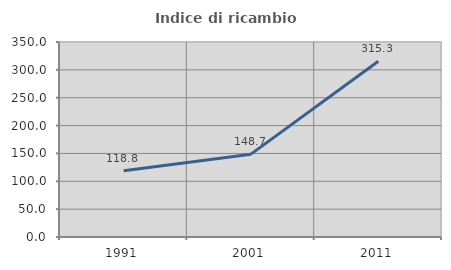
| Category | Indice di ricambio occupazionale  |
|---|---|
| 1991.0 | 118.812 |
| 2001.0 | 148.703 |
| 2011.0 | 315.309 |